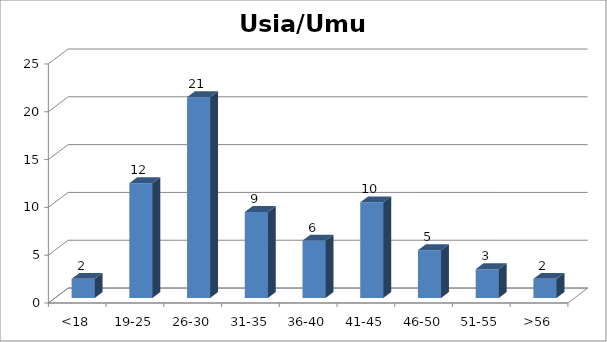
| Category | Usia/Umur |
|---|---|
| <18 | 2 |
| 19-25 | 12 |
| 26-30 | 21 |
| 31-35 | 9 |
| 36-40 | 6 |
| 41-45 | 10 |
| 46-50 | 5 |
| 51-55 | 3 |
| >56 | 2 |